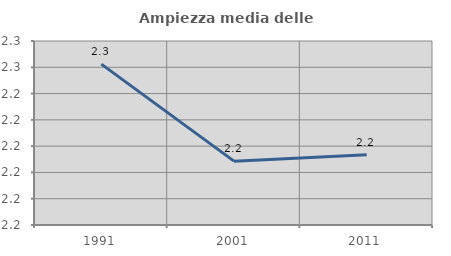
| Category | Ampiezza media delle famiglie |
|---|---|
| 1991.0 | 2.251 |
| 2001.0 | 2.214 |
| 2011.0 | 2.217 |